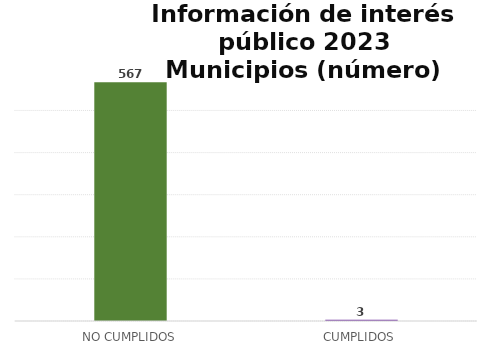
| Category | Series 0 |
|---|---|
| NO CUMPLIDOS | 567 |
| CUMPLIDOS | 3 |